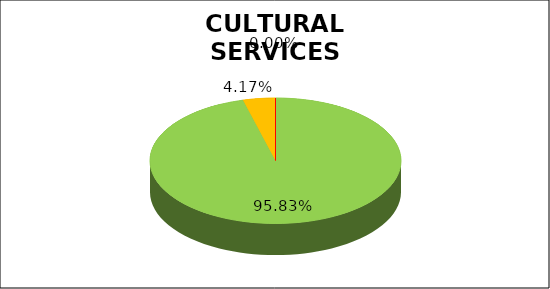
| Category | Series 0 |
|---|---|
| Green | 0.958 |
| Amber | 0.042 |
| Red | 0 |